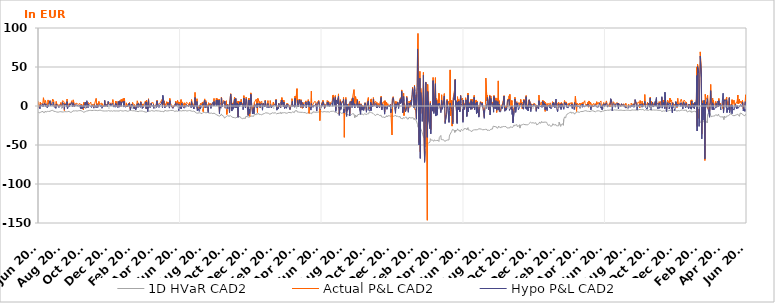
| Category | 1D HVaR CAD2 | Actual P&L CAD2 | Hypo P&L CAD2 |
|---|---|---|---|
| 2017-06-30 | -7.665 | 6.556 | 1.013 |
| 2017-07-03 | -8.736 | -2.044 | -0.77 |
| 2017-07-04 | -7.466 | 0.823 | -1.298 |
| 2017-07-05 | -8.721 | -0.991 | -3.645 |
| 2017-07-06 | -8.22 | 4.793 | 1.523 |
| 2017-07-07 | -7.865 | 1.851 | -0.303 |
| 2017-07-10 | -7.202 | 3.301 | 1.161 |
| 2017-07-11 | -7.861 | 4.235 | 0.22 |
| 2017-07-12 | -7.487 | 1.33 | 2.874 |
| 2017-07-13 | -6.965 | 1.964 | -1.013 |
| 2017-07-14 | -8.392 | 10.584 | 1.428 |
| 2017-07-17 | -8.446 | 1.4 | 3.583 |
| 2017-07-18 | -6.813 | 4.169 | 1.582 |
| 2017-07-19 | -6.78 | 7.102 | -0.508 |
| 2017-07-20 | -7.824 | 5.175 | 2.669 |
| 2017-07-21 | -7.661 | 3.454 | 0.837 |
| 2017-07-24 | -6.897 | 1.02 | -2.542 |
| 2017-07-25 | -7.229 | 4.137 | 0.956 |
| 2017-07-26 | -6.917 | 7.772 | -0.863 |
| 2017-07-27 | -6.972 | 2.997 | -0.088 |
| 2017-07-28 | -7.136 | 4.401 | 0.234 |
| 2017-07-31 | -6.829 | 6.984 | 6.676 |
| 2017-08-01 | -6.113 | 1.55 | 0.236 |
| 2017-08-02 | -6.132 | 0.931 | 2.816 |
| 2017-08-03 | -5.893 | 1.901 | 1.328 |
| 2017-08-04 | -6.124 | 2.612 | 1.423 |
| 2017-08-07 | -5.665 | 8.896 | 0.871 |
| 2017-08-08 | -6.285 | 5.996 | 4.896 |
| 2017-08-09 | -6.179 | 7.435 | 3.178 |
| 2017-08-10 | -6.754 | 4.971 | 2.024 |
| 2017-08-11 | -6.806 | -0.431 | -1.643 |
| 2017-08-14 | -7.089 | 0.208 | -0.708 |
| 2017-08-15 | -7.414 | -1.648 | -3.011 |
| 2017-08-16 | -7.608 | 5.716 | 2.406 |
| 2017-08-17 | -7.654 | 4.615 | 1.592 |
| 2017-08-18 | -7.727 | 1.045 | 1.227 |
| 2017-08-21 | -7.966 | 1.667 | 0.193 |
| 2017-08-22 | -7.742 | 1.239 | -0.055 |
| 2017-08-23 | -7.554 | -0.463 | -2.139 |
| 2017-08-24 | -7.479 | 1.719 | 0.267 |
| 2017-08-25 | -7.022 | 0.143 | 0.042 |
| 2017-08-28 | -7.244 | 4.5 | 1.693 |
| 2017-08-29 | -7.279 | 1.522 | -1.103 |
| 2017-08-30 | -7.347 | 2.32 | -0.086 |
| 2017-08-31 | -7.709 | -0.311 | -2.608 |
| 2017-09-01 | -8.064 | 6.81 | 4.447 |
| 2017-09-04 | -7.595 | 6.241 | 3.167 |
| 2017-09-05 | -7.496 | 4.82 | 1.446 |
| 2017-09-06 | -7.215 | -5.875 | -4.298 |
| 2017-09-07 | -7.239 | 4.048 | 1.929 |
| 2017-09-08 | -7.657 | 1.457 | 0.736 |
| 2017-09-11 | -7.385 | 2.412 | 1.974 |
| 2017-09-12 | -7.322 | 3.681 | -0.904 |
| 2017-09-13 | -7.27 | 8.908 | 5.5 |
| 2017-09-14 | -7.28 | -2.275 | -3.678 |
| 2017-09-15 | -7.859 | 3 | -2.313 |
| 2017-09-18 | -6.779 | 0.09 | 0.648 |
| 2017-09-19 | -6.939 | 3.59 | -1.119 |
| 2017-09-20 | -6.919 | 3.335 | 2.442 |
| 2017-09-21 | -8.062 | 2.416 | 1.151 |
| 2017-09-22 | -8.07 | 2.415 | 0.214 |
| 2017-09-25 | -7.959 | 6.85 | 4.741 |
| 2017-09-26 | -7.657 | 4.799 | 0.805 |
| 2017-09-27 | -7.062 | 1.251 | -1.131 |
| 2017-09-28 | -6.203 | -0.387 | -0.55 |
| 2017-09-29 | -5.855 | 7.843 | 4.039 |
| 2017-10-02 | -6.341 | -0.167 | -1.149 |
| 2017-10-03 | -6.052 | 0.263 | 0.676 |
| 2017-10-04 | -6.248 | 1.795 | 0.16 |
| 2017-10-05 | -6.122 | 2.02 | 1.811 |
| 2017-10-06 | -6.469 | 3.749 | 1.398 |
| 2017-10-09 | -6.471 | 2.981 | 1.281 |
| 2017-10-10 | -5.888 | 2.25 | -0.027 |
| 2017-10-11 | -6.068 | 2.738 | 0.204 |
| 2017-10-12 | -6.073 | 1.963 | 0.523 |
| 2017-10-13 | -5.692 | 2.634 | 0.111 |
| 2017-10-16 | -5.878 | 3.4 | 1.08 |
| 2017-10-17 | -5.782 | 2.147 | -1.862 |
| 2017-10-18 | -5.895 | 4.182 | 1.194 |
| 2017-10-19 | -5.913 | -2.118 | -3.751 |
| 2017-10-20 | -6.761 | 2.38 | 1.331 |
| 2017-10-23 | -7.039 | -1.105 | -3.435 |
| 2017-10-24 | -7.246 | 1.554 | -0.65 |
| 2017-10-25 | -8.241 | -4.882 | -0.85 |
| 2017-10-26 | -7.996 | 4.506 | 1.011 |
| 2017-10-27 | -7.395 | -0.768 | -2.56 |
| 2017-10-30 | -7.276 | 4.737 | 4.769 |
| 2017-10-31 | -6.786 | -2.424 | -2.858 |
| 2017-11-01 | -6.745 | -0.642 | -0.784 |
| 2017-11-02 | -6.505 | 5.08 | 2.363 |
| 2017-11-03 | -6.068 | 0.666 | 6.761 |
| 2017-11-06 | -6.181 | 0.469 | -2.014 |
| 2017-11-07 | -6.971 | 4.508 | 2.454 |
| 2017-11-08 | -6.804 | 4.96 | 3.527 |
| 2017-11-09 | -5.621 | 3.301 | 1.291 |
| 2017-11-10 | -5.436 | 2.225 | 0.687 |
| 2017-11-13 | -5.644 | 4.996 | -0.628 |
| 2017-11-14 | -5.746 | 3.19 | -0.983 |
| 2017-11-15 | -6.133 | 0.758 | -2.01 |
| 2017-11-16 | -5.894 | 1.748 | 0.057 |
| 2017-11-17 | -5.359 | 1.644 | 1.487 |
| 2017-11-20 | -5.626 | 2.256 | -1.486 |
| 2017-11-21 | -6.342 | -1.938 | -2.884 |
| 2017-11-22 | -5.814 | -0.786 | -0.828 |
| 2017-11-23 | -5.562 | 2.935 | 1.632 |
| 2017-11-24 | -5.311 | 3.062 | 0.467 |
| 2017-11-27 | -5.647 | 9.736 | -2.493 |
| 2017-11-28 | -4.719 | 1.336 | 0.535 |
| 2017-11-29 | -5.291 | 3.304 | 1.963 |
| 2017-11-30 | -5.938 | 2.812 | -0.091 |
| 2017-12-01 | -6.282 | -0.957 | -2.197 |
| 2017-12-04 | -5.692 | 5.767 | 1.226 |
| 2017-12-05 | -5.127 | 3.719 | 1.956 |
| 2017-12-06 | -5.177 | 3.158 | 1.196 |
| 2017-12-07 | -5.159 | 2.348 | 1.782 |
| 2017-12-08 | -5 | 1.365 | -0.97 |
| 2017-12-11 | -5.926 | 3.803 | 1.026 |
| 2017-12-12 | -4.933 | -0.133 | -2.885 |
| 2017-12-13 | -5.327 | 2.893 | -1.377 |
| 2017-12-14 | -6.259 | 2.022 | -0.09 |
| 2017-12-15 | -6.352 | 0.302 | 0.049 |
| 2017-12-18 | -6.434 | 1.2 | -0.583 |
| 2017-12-19 | -6.301 | 6.991 | 7.225 |
| 2017-12-20 | -6.864 | 1.833 | -0.191 |
| 2017-12-21 | -6.388 | -0.457 | -1.274 |
| 2017-12-22 | -6.597 | 1.801 | 2.214 |
| 2017-12-26 | -6.359 | 1.319 | -1.292 |
| 2017-12-27 | -6.161 | 1.015 | -1.279 |
| 2017-12-28 | -5.639 | 5.011 | 5.98 |
| 2017-12-29 | -5.86 | 3.197 | 2.404 |
| 2018-01-02 | -6.593 | 4.213 | 1.071 |
| 2018-01-03 | -6.294 | 5.059 | 2.886 |
| 2018-01-04 | -5.927 | 1.002 | 0.179 |
| 2018-01-05 | -6.091 | 2.884 | 0.787 |
| 2018-01-08 | -6.718 | 4.931 | 3.457 |
| 2018-01-09 | -6.24 | 8.214 | 3.004 |
| 2018-01-10 | -6.098 | 4.228 | 2.962 |
| 2018-01-11 | -6.09 | 2.251 | -1.362 |
| 2018-01-12 | -6.303 | 2.98 | 0.914 |
| 2018-01-15 | -6.422 | 0.087 | -1.624 |
| 2018-01-16 | -6.323 | 6.084 | 3.629 |
| 2018-01-17 | -6.538 | 0.494 | -0.535 |
| 2018-01-18 | -6.32 | 5.716 | 2.665 |
| 2018-01-19 | -6.38 | 2.439 | -0.205 |
| 2018-01-22 | -6.398 | -0.852 | -2.18 |
| 2018-01-23 | -6.743 | 5.699 | 5.684 |
| 2018-01-24 | -6.317 | 6.515 | 3.678 |
| 2018-01-25 | -6.479 | -0.916 | -1.582 |
| 2018-01-26 | -5.455 | 6.332 | 5.846 |
| 2018-01-29 | -5.677 | 8.105 | 5.537 |
| 2018-01-30 | -6.53 | -0.321 | -0.484 |
| 2018-01-31 | -6.691 | 2.122 | 0.169 |
| 2018-02-01 | -6.287 | 8.636 | 4.873 |
| 2018-02-02 | -5.573 | 5.203 | 4.195 |
| 2018-02-05 | -6.504 | 9.663 | 5.501 |
| 2018-02-06 | -6.268 | 1.329 | -1.35 |
| 2018-02-07 | -6.415 | 5.422 | 5.962 |
| 2018-02-08 | -6.052 | 9.857 | -0.484 |
| 2018-02-09 | -6.04 | -0.373 | -1.373 |
| 2018-02-12 | -5.917 | 0.584 | -1.479 |
| 2018-02-13 | -6.483 | 4.019 | -0.646 |
| 2018-02-14 | -6.437 | -0.803 | -1.588 |
| 2018-02-15 | -6.756 | 0.089 | 0.252 |
| 2018-02-16 | -6.65 | 1.439 | -1.14 |
| 2018-02-19 | -6.479 | 3.38 | 2.998 |
| 2018-02-20 | -6.079 | 2.05 | -0.335 |
| 2018-02-21 | -6.172 | 4.531 | 3.234 |
| 2018-02-22 | -5.66 | -2.239 | 0.614 |
| 2018-02-23 | -6.359 | -4.019 | -5.205 |
| 2018-02-26 | -5.815 | 2.404 | 0.808 |
| 2018-02-27 | -6.21 | 0.741 | 2.629 |
| 2018-02-28 | -6.742 | -1.139 | -1.282 |
| 2018-03-01 | -6.119 | 4.418 | 1.337 |
| 2018-03-02 | -6.363 | 2.639 | 2.295 |
| 2018-03-05 | -6.043 | -1.891 | -3.845 |
| 2018-03-06 | -5.866 | 1.803 | 0.067 |
| 2018-03-07 | -6.4 | 0.363 | -1.423 |
| 2018-03-08 | -6.586 | 0.149 | -2.284 |
| 2018-03-09 | -6.577 | -3.838 | -5.225 |
| 2018-03-12 | -6.674 | 3.198 | 1.242 |
| 2018-03-13 | -6.298 | 6.641 | 2.757 |
| 2018-03-14 | -7.076 | 4.588 | 1.021 |
| 2018-03-15 | -7.362 | -1.007 | -1.97 |
| 2018-03-16 | -7.093 | 3.964 | 3.247 |
| 2018-03-19 | -6.499 | 1.345 | -0.3 |
| 2018-03-20 | -7.053 | -1.056 | -1.407 |
| 2018-03-21 | -6.725 | -0.002 | -1.852 |
| 2018-03-22 | -6.436 | 5.664 | 5.035 |
| 2018-03-23 | -6.732 | 5.135 | 3.273 |
| 2018-03-26 | -6.471 | -1.286 | -3.153 |
| 2018-03-27 | -6.438 | 2.615 | -0.925 |
| 2018-03-28 | -6.872 | 0.713 | -2.5 |
| 2018-03-29 | -7.042 | 1.297 | -0.701 |
| 2018-03-30 | -7.055 | 1.988 | -0.311 |
| 2018-04-02 | -7.569 | 5.054 | 2.227 |
| 2018-04-03 | -6.856 | 6.452 | 1.336 |
| 2018-04-04 | -8.219 | 6.023 | 5.219 |
| 2018-04-05 | -8.048 | -3.247 | -3.25 |
| 2018-04-06 | -7.232 | 7.484 | 5.141 |
| 2018-04-09 | -6.97 | -3.64 | -6.906 |
| 2018-04-10 | -7.793 | 1.901 | -1.211 |
| 2018-04-11 | -7.561 | 9.306 | 8.168 |
| 2018-04-12 | -6.63 | 0.476 | -1.902 |
| 2018-04-13 | -6.198 | 1.599 | 0.527 |
| 2018-04-16 | -6.549 | 0.901 | -2.034 |
| 2018-04-17 | -6.818 | 1.982 | 0.374 |
| 2018-04-18 | -6.401 | 3.956 | 3.692 |
| 2018-04-19 | -5.888 | 3.21 | 0.803 |
| 2018-04-20 | -6.791 | 3.047 | 0.497 |
| 2018-04-23 | -6.343 | 4.336 | -0.385 |
| 2018-04-24 | -5.814 | 3.721 | 1.862 |
| 2018-04-25 | -6.082 | -1.936 | -3.139 |
| 2018-04-26 | -6.665 | 0.142 | -3.444 |
| 2018-04-27 | -6.075 | -0.745 | -0.963 |
| 2018-04-30 | -5.927 | 0.252 | 0.935 |
| 2018-05-01 | -5.637 | 2.891 | -1.941 |
| 2018-05-02 | -6.065 | -0.801 | -2.804 |
| 2018-05-03 | -6.283 | 7.23 | 6.497 |
| 2018-05-04 | -6.302 | 3.206 | -0.565 |
| 2018-05-07 | -6.28 | 2.605 | 1.769 |
| 2018-05-08 | -6.392 | 2.463 | -1.83 |
| 2018-05-09 | -6.441 | 2.21 | -0.58 |
| 2018-05-10 | -6.532 | 3.191 | 1.517 |
| 2018-05-11 | -6.669 | 3.978 | 1.018 |
| 2018-05-14 | -6.991 | 6.816 | 2.597 |
| 2018-05-15 | -7.473 | 8.173 | 5.452 |
| 2018-05-16 | -7.265 | 5.834 | 4.024 |
| 2018-05-17 | -6.9 | 0.166 | -2.106 |
| 2018-05-18 | -7.552 | 5.664 | 13.638 |
| 2018-05-21 | -7.523 | 1.119 | 3.233 |
| 2018-05-22 | -6.931 | 6.521 | 1.516 |
| 2018-05-23 | -5.555 | -0.455 | -2.523 |
| 2018-05-24 | -5.652 | 2.126 | -0.894 |
| 2018-05-25 | -5.963 | -0.236 | -0.842 |
| 2018-05-28 | -6.425 | 5.547 | -0.209 |
| 2018-05-29 | -7.109 | 4.509 | 0.785 |
| 2018-05-30 | -6.306 | 2.2 | 1.084 |
| 2018-05-31 | -6.303 | 5.106 | 3.642 |
| 2018-06-01 | -6.684 | 4.896 | 2.266 |
| 2018-06-04 | -5.961 | -1.097 | -2.7 |
| 2018-06-05 | -5.661 | 9.617 | 6.862 |
| 2018-06-06 | -5.717 | 4.31 | 1.829 |
| 2018-06-07 | -5.732 | 3.802 | 2.228 |
| 2018-06-08 | -5.233 | 2.433 | 1.336 |
| 2018-06-11 | -5.66 | -0.082 | -1.745 |
| 2018-06-12 | -5.429 | -2.465 | -2.976 |
| 2018-06-13 | -5.466 | -1.682 | -3.171 |
| 2018-06-14 | -5.829 | -1.159 | -3.322 |
| 2018-06-15 | -5.743 | -1.055 | -0.569 |
| 2018-06-18 | -7.061 | 2.239 | -0.002 |
| 2018-06-19 | -6.649 | 0.651 | -0.591 |
| 2018-06-20 | -6.299 | 6.087 | 4.163 |
| 2018-06-21 | -6.249 | 1.815 | 0.041 |
| 2018-06-22 | -6.181 | 1.159 | 0.161 |
| 2018-06-25 | -6.787 | 7.105 | 3.151 |
| 2018-06-26 | -6.511 | 3.333 | 0.947 |
| 2018-06-27 | -6.67 | 5.214 | 1.276 |
| 2018-06-28 | -6.092 | 1.524 | -5.756 |
| 2018-06-29 | -6.13 | 5.018 | 2.015 |
| 2018-07-02 | -6.105 | 0.344 | -3.248 |
| 2018-07-03 | -6.357 | 1.463 | -2.886 |
| 2018-07-04 | -6.588 | 8.232 | 0.92 |
| 2018-07-05 | -6.408 | -1.893 | -3.401 |
| 2018-07-06 | -6.1 | 5.354 | 3.421 |
| 2018-07-09 | -5.881 | 4.075 | -0.804 |
| 2018-07-10 | -5.771 | 2.534 | 0.412 |
| 2018-07-11 | -6.226 | 2.849 | 0.386 |
| 2018-07-12 | -6.109 | -1.086 | -2.846 |
| 2018-07-13 | -6.57 | 4.052 | 0.694 |
| 2018-07-16 | -5.783 | 0.755 | -1.655 |
| 2018-07-17 | -6.712 | 3.376 | 0.153 |
| 2018-07-18 | -6.858 | 4.755 | 1.989 |
| 2018-07-19 | -6.478 | 3.851 | 0.726 |
| 2018-07-20 | -5.991 | 3.904 | 1.931 |
| 2018-07-23 | -6.012 | 2.566 | -0.891 |
| 2018-07-24 | -6.018 | 0.43 | -1.311 |
| 2018-07-25 | -5.929 | -0.305 | -1.621 |
| 2018-07-26 | -5.744 | 4.61 | 2.17 |
| 2018-07-27 | -6.374 | 3.145 | 2.017 |
| 2018-07-30 | -6.364 | -0.165 | -2.108 |
| 2018-07-31 | -6.394 | 8.186 | 5.541 |
| 2018-08-01 | -6.777 | 8.94 | 4.756 |
| 2018-08-02 | -6.831 | 0.041 | -1.011 |
| 2018-08-03 | -7.101 | 3.053 | 1.386 |
| 2018-08-06 | -6.51 | -1.424 | -3.861 |
| 2018-08-07 | -6.526 | 1.113 | -1.551 |
| 2018-08-08 | -7.227 | 1.223 | 0.71 |
| 2018-08-09 | -7.652 | 17.463 | 10.902 |
| 2018-08-10 | -8.714 | 3.3 | 0.598 |
| 2018-08-13 | -9.066 | 0.535 | -1.642 |
| 2018-08-14 | -8.79 | 9.318 | 5.803 |
| 2018-08-15 | -9.415 | -4.045 | -5.883 |
| 2018-08-16 | -9.191 | 0.111 | -2.187 |
| 2018-08-17 | -9.323 | -1.094 | -2.598 |
| 2018-08-20 | -8.637 | -3.775 | -6.973 |
| 2018-08-21 | -8.67 | -3.9 | -5.49 |
| 2018-08-22 | -8.476 | 1.58 | 1.133 |
| 2018-08-23 | -9.022 | -1.201 | -3.441 |
| 2018-08-24 | -9.507 | 3.767 | -0.306 |
| 2018-08-27 | -9.848 | 1.004 | -1.855 |
| 2018-08-28 | -8.641 | 5.166 | 3.028 |
| 2018-08-29 | -8.688 | 3.952 | 3.13 |
| 2018-08-30 | -8.214 | -7.116 | 0.898 |
| 2018-08-31 | -8.327 | 3.768 | 2.082 |
| 2018-09-03 | -8.245 | 9.125 | 7.499 |
| 2018-09-04 | -9.431 | -0.417 | -2.143 |
| 2018-09-05 | -9.014 | 2.181 | -1.717 |
| 2018-09-06 | -8.809 | 6.875 | 4.728 |
| 2018-09-07 | -8.94 | 0.253 | -1.824 |
| 2018-09-10 | -8.297 | 1.717 | 0.071 |
| 2018-09-11 | -9.289 | -1.919 | -3.19 |
| 2018-09-12 | -9.132 | -6.634 | -8.279 |
| 2018-09-13 | -8.796 | 4.156 | 1.034 |
| 2018-09-14 | -8.418 | 0.77 | 0.004 |
| 2018-09-17 | -9.327 | 3.823 | 1.67 |
| 2018-09-18 | -8.792 | 4.463 | 0.827 |
| 2018-09-19 | -8.969 | -1.631 | -3.106 |
| 2018-09-20 | -8.995 | 0.41 | 0.941 |
| 2018-09-21 | -8.354 | 2.886 | 2.005 |
| 2018-09-24 | -9.83 | 3.989 | 4.59 |
| 2018-09-25 | -10.018 | 0.911 | -0.072 |
| 2018-09-26 | -9.277 | 5.372 | -0.127 |
| 2018-09-27 | -9.047 | 9.713 | 5.647 |
| 2018-09-28 | -9.656 | 1.657 | 0.097 |
| 2018-10-01 | -10.491 | 2.689 | 1.813 |
| 2018-10-02 | -9.803 | 2.557 | 1.574 |
| 2018-10-03 | -10.574 | 9.996 | 7.554 |
| 2018-10-04 | -11.31 | 3.029 | 0.27 |
| 2018-10-05 | -12.262 | 9.466 | 7.757 |
| 2018-10-08 | -12.366 | 1.344 | 0.954 |
| 2018-10-09 | -11.596 | 5.326 | 1.742 |
| 2018-10-10 | -11.92 | 8.942 | 7.492 |
| 2018-10-11 | -12.994 | -7.854 | -9.692 |
| 2018-10-12 | -12.214 | 0.76 | -0.397 |
| 2018-10-15 | -11.796 | 4.646 | -2.862 |
| 2018-10-16 | -10.141 | 11.299 | 10.458 |
| 2018-10-17 | -11.732 | 8.801 | 5.503 |
| 2018-10-18 | -12.898 | -0.737 | -0.998 |
| 2018-10-19 | -12.349 | 3.732 | 1.804 |
| 2018-10-22 | -13.195 | 7.25 | 4.35 |
| 2018-10-23 | -13.759 | 5.836 | 5.646 |
| 2018-10-24 | -15.449 | 5.157 | 2.909 |
| 2018-10-25 | -16.031 | 7.096 | 6.069 |
| 2018-10-26 | -14.398 | -2.894 | -2.054 |
| 2018-10-29 | -13.391 | 6.664 | 1.083 |
| 2018-10-30 | -13.029 | -10.807 | -3.852 |
| 2018-10-31 | -12.582 | -4.691 | -4.93 |
| 2018-11-01 | -12.341 | 2.006 | 1.705 |
| 2018-11-02 | -13.145 | -0.048 | -1.415 |
| 2018-11-05 | -13.187 | 2.056 | -3.935 |
| 2018-11-06 | -12.691 | -5.414 | -8.578 |
| 2018-11-07 | -12.024 | 7.177 | 5.035 |
| 2018-11-08 | -12.166 | 11.552 | 12.217 |
| 2018-11-09 | -13.445 | 15.844 | 15.309 |
| 2018-11-12 | -14.147 | 1.756 | -6.454 |
| 2018-11-13 | -14.241 | 3.839 | 2.57 |
| 2018-11-14 | -14.931 | 3.26 | 1.197 |
| 2018-11-15 | -14.607 | -1.913 | -4.257 |
| 2018-11-16 | -15.526 | 1.7 | -0.224 |
| 2018-11-19 | -14.953 | 11.423 | 8.916 |
| 2018-11-20 | -15.981 | 1.048 | -1.859 |
| 2018-11-21 | -15.628 | -1.916 | -2.965 |
| 2018-11-22 | -15.256 | 9.374 | 9.591 |
| 2018-11-23 | -15.126 | -0.311 | -2.298 |
| 2018-11-26 | -14.148 | 5.756 | 3.873 |
| 2018-11-27 | -13.959 | -1.573 | -5.353 |
| 2018-11-28 | -13.539 | -13.615 | -14.516 |
| 2018-11-29 | -14.101 | 6.351 | 2.031 |
| 2018-11-30 | -14.34 | 2.364 | -0.783 |
| 2018-12-03 | -13.393 | 6.039 | 4.937 |
| 2018-12-04 | -14.826 | 2.231 | 1.086 |
| 2018-12-05 | -14.924 | 4.927 | 0.587 |
| 2018-12-06 | -15.743 | 8.733 | 5.062 |
| 2018-12-07 | -15.688 | 2.379 | 1.889 |
| 2018-12-10 | -16.338 | 3.213 | 2.125 |
| 2018-12-11 | -15.77 | -0.957 | -4.746 |
| 2018-12-12 | -15.249 | -1.818 | -3.994 |
| 2018-12-13 | -15.528 | 13.254 | 9.977 |
| 2018-12-14 | -15.742 | 3.346 | 1.565 |
| 2018-12-17 | -15.925 | 0.432 | -2.452 |
| 2018-12-18 | -13.421 | 0.644 | -1.755 |
| 2018-12-19 | -13.633 | 11.426 | 9.198 |
| 2018-12-20 | -13.838 | 7.77 | 7.493 |
| 2018-12-21 | -13.453 | 6.716 | 8.164 |
| 2018-12-24 | -14.066 | -11.08 | -12.327 |
| 2018-12-26 | -13.773 | 10.13 | 7.735 |
| 2018-12-27 | -14.255 | -1.484 | 0.085 |
| 2018-12-28 | -13.65 | -13.163 | -9.82 |
| 2018-12-31 | -13.055 | 16.814 | 14.988 |
| 2019-01-02 | -12.382 | 2.161 | 1.366 |
| 2019-01-03 | -12.876 | -3.85 | -1.556 |
| 2019-01-04 | -13.781 | -6.988 | -10.217 |
| 2019-01-07 | -13.306 | 1.164 | -2.532 |
| 2019-01-08 | -13.582 | -7.074 | -10 |
| 2019-01-09 | -10.676 | 4.604 | -0.156 |
| 2019-01-10 | -9.804 | 3.783 | -0.679 |
| 2019-01-11 | -10.363 | 3.974 | 1.948 |
| 2019-01-14 | -11.26 | 8.801 | -1.987 |
| 2019-01-15 | -9.726 | -0.103 | -0.227 |
| 2019-01-16 | -9.953 | 6.126 | 3.442 |
| 2019-01-17 | -10.468 | -8.299 | -2.391 |
| 2019-01-18 | -10.4 | 9.755 | 0.485 |
| 2019-01-21 | -9.652 | 5.589 | 3.447 |
| 2019-01-22 | -11.055 | 2.495 | 0.702 |
| 2019-01-23 | -11.105 | 5.627 | 2.757 |
| 2019-01-24 | -10.377 | -2.147 | -1.623 |
| 2019-01-25 | -10.891 | 3.898 | 2.046 |
| 2019-01-28 | -11.266 | 6.062 | 3.432 |
| 2019-01-29 | -10.874 | 1.139 | -2.057 |
| 2019-01-30 | -11.253 | 1.645 | -5.367 |
| 2019-01-31 | -10.316 | 0.772 | 1.466 |
| 2019-02-01 | -9.978 | 3.906 | 3.584 |
| 2019-02-04 | -9.641 | -0.159 | -1.264 |
| 2019-02-05 | -8.717 | 1.895 | 1.398 |
| 2019-02-06 | -9.035 | 7.502 | 6.654 |
| 2019-02-07 | -8.756 | 6.425 | 6.176 |
| 2019-02-08 | -9.39 | 0.56 | -0.614 |
| 2019-02-11 | -8.948 | -0.32 | -2.269 |
| 2019-02-12 | -9.303 | 2.397 | -0.867 |
| 2019-02-13 | -9.184 | 6.951 | 3.221 |
| 2019-02-14 | -9.255 | -1.299 | -1.754 |
| 2019-02-15 | -10.039 | -0.597 | -2.546 |
| 2019-02-18 | -10.531 | -0.213 | -1.568 |
| 2019-02-19 | -10.686 | 6.953 | -0.704 |
| 2019-02-20 | -9.341 | 3.58 | 1.765 |
| 2019-02-21 | -9.822 | 2.052 | 1.32 |
| 2019-02-22 | -9.059 | -0.479 | -2.539 |
| 2019-02-25 | -8.658 | 1.194 | 0.352 |
| 2019-02-26 | -9.695 | 0.768 | 0.032 |
| 2019-02-27 | -9.543 | 5.099 | 1.53 |
| 2019-02-28 | -9.125 | 1.446 | 0.89 |
| 2019-03-01 | -9.17 | 1.524 | 1.609 |
| 2019-03-04 | -8.629 | 3.257 | 2.078 |
| 2019-03-05 | -9.209 | 2.282 | 0.139 |
| 2019-03-06 | -9.739 | 8.638 | 7.828 |
| 2019-03-07 | -9.999 | 8.272 | 7.009 |
| 2019-03-08 | -10.186 | -3.025 | -5.296 |
| 2019-03-11 | -9.379 | -0.902 | -1.895 |
| 2019-03-12 | -9.941 | -0.913 | -3.436 |
| 2019-03-13 | -8.407 | 3.643 | 3.023 |
| 2019-03-14 | -9.358 | 0.258 | 0.029 |
| 2019-03-15 | -8.962 | 0.125 | -1.025 |
| 2019-03-18 | -8.029 | -1.752 | -2.428 |
| 2019-03-19 | -10.144 | 7.738 | 5.327 |
| 2019-03-20 | -8.846 | 4.312 | 1.242 |
| 2019-03-21 | -7.915 | 10.777 | 7.406 |
| 2019-03-22 | -8.5 | 4.173 | 4.12 |
| 2019-03-25 | -8.689 | 0.508 | -1.321 |
| 2019-03-26 | -8.79 | 7.423 | 5.08 |
| 2019-03-27 | -8.089 | 4.072 | 2.583 |
| 2019-03-28 | -8.457 | 4.175 | -3.334 |
| 2019-03-29 | -7.866 | -1.805 | -3.393 |
| 2019-04-01 | -9.244 | 1.385 | 0.981 |
| 2019-04-02 | -8.366 | 0.855 | -2.904 |
| 2019-04-03 | -9.209 | 3.664 | 2.02 |
| 2019-04-04 | -9.102 | 0.548 | -1.151 |
| 2019-04-05 | -8.256 | 3.092 | 2.11 |
| 2019-04-08 | -8.093 | 1.558 | -0.557 |
| 2019-04-09 | -8.805 | 2.671 | 0.45 |
| 2019-04-10 | -9.118 | -0.095 | 0.684 |
| 2019-04-11 | -8.485 | -4.278 | -4.855 |
| 2019-04-12 | -9.107 | -1.513 | -2.408 |
| 2019-04-15 | -8.582 | 2.869 | 0.668 |
| 2019-04-16 | -8.009 | 9.402 | 0.996 |
| 2019-04-17 | -8.234 | 6.427 | 5.998 |
| 2019-04-18 | -7.417 | -0.035 | -0.563 |
| 2019-04-19 | -7.524 | -0.243 | 0.233 |
| 2019-04-22 | -8.478 | 1.283 | 0.942 |
| 2019-04-23 | -7.746 | -0.828 | -1.596 |
| 2019-04-24 | -6.143 | 12.615 | 9.705 |
| 2019-04-25 | -6.268 | 1.956 | -0.047 |
| 2019-04-26 | -5.978 | 1.583 | 0.88 |
| 2019-04-29 | -6.085 | 22.223 | -1.51 |
| 2019-04-30 | -7.724 | 3.567 | 3.293 |
| 2019-05-01 | -7.783 | 8.946 | 7.359 |
| 2019-05-02 | -7.584 | -0.537 | -1.202 |
| 2019-05-03 | -7.789 | 0.618 | 0.467 |
| 2019-05-06 | -8.039 | 8.659 | 7.788 |
| 2019-05-07 | -8.217 | 4.593 | 4.442 |
| 2019-05-08 | -8.389 | 5.789 | 3.627 |
| 2019-05-09 | -8.089 | -2.012 | -1.578 |
| 2019-05-10 | -7.818 | 7.936 | 6.664 |
| 2019-05-13 | -8.123 | -2.907 | 1.895 |
| 2019-05-14 | -7.338 | 4.528 | 1.507 |
| 2019-05-15 | -8.281 | -0.601 | -2.103 |
| 2019-05-16 | -8.457 | 3.33 | 1.967 |
| 2019-05-17 | -8.541 | 2.67 | 0.405 |
| 2019-05-20 | -8.393 | 4.061 | 1.52 |
| 2019-05-21 | -8.619 | 4.635 | 0.526 |
| 2019-05-22 | -8.397 | 6.587 | 5.119 |
| 2019-05-23 | -9.381 | -1.599 | -2.248 |
| 2019-05-24 | -9.263 | 2.384 | 2.494 |
| 2019-05-27 | -8.854 | 3.92 | 2.089 |
| 2019-05-28 | -8.106 | 8.184 | 6.055 |
| 2019-05-29 | -8.265 | 0.521 | -1.121 |
| 2019-05-30 | -7.834 | -9.489 | 5.497 |
| 2019-05-31 | -9.293 | 0.117 | -0.169 |
| 2019-06-03 | -9.287 | -2.439 | -3.429 |
| 2019-06-04 | -8.639 | -3.332 | -5.238 |
| 2019-06-05 | -8.43 | 19.104 | 3.149 |
| 2019-06-06 | -9.996 | -1.416 | -1.622 |
| 2019-06-07 | -8.003 | 0.865 | 0.149 |
| 2019-06-10 | -8.345 | 2.741 | -1.645 |
| 2019-06-11 | -6.976 | 3.34 | 1.17 |
| 2019-06-12 | -7.053 | 3.968 | 2.177 |
| 2019-06-13 | -7.464 | 5.737 | 1.25 |
| 2019-06-14 | -8.162 | 5.404 | 0.311 |
| 2019-06-17 | -7.838 | 5.016 | 3.2 |
| 2019-06-18 | -7.707 | -1.182 | -3.493 |
| 2019-06-19 | -7.63 | -0.902 | -6.502 |
| 2019-06-20 | -7.934 | 2.08 | 0.368 |
| 2019-06-21 | -8.075 | 5.023 | 1.842 |
| 2019-06-24 | -7.686 | 7.359 | 5.923 |
| 2019-06-25 | -7.225 | 5.858 | 1.608 |
| 2019-06-26 | -7.103 | 1.74 | -1.499 |
| 2019-06-27 | -7.167 | -18.792 | -1.442 |
| 2019-06-28 | -7.39 | -3.999 | -4.504 |
| 2019-07-01 | -7.2 | 1.568 | -0.482 |
| 2019-07-02 | -7.579 | 4.286 | 2.899 |
| 2019-07-03 | -7.758 | 2.389 | -0.116 |
| 2019-07-04 | -7.72 | 2.907 | 1.884 |
| 2019-07-05 | -8.108 | 7.273 | 5.456 |
| 2019-07-08 | -7.135 | 1.498 | 0.677 |
| 2019-07-09 | -7.459 | -3.087 | -2.884 |
| 2019-07-10 | -7.038 | -2.006 | -3.798 |
| 2019-07-11 | -7.294 | 1.837 | 0.773 |
| 2019-07-12 | -8.064 | 2.707 | 1.63 |
| 2019-07-15 | -7.574 | 3.217 | 1.333 |
| 2019-07-16 | -7.201 | 7.014 | 4.752 |
| 2019-07-17 | -8.129 | 6.707 | 2.654 |
| 2019-07-18 | -7.335 | 2.095 | -0.253 |
| 2019-07-19 | -7.448 | 6.124 | 4.341 |
| 2019-07-22 | -7.91 | 4.748 | -0.515 |
| 2019-07-23 | -7.166 | 0.48 | -0.792 |
| 2019-07-24 | -6.688 | 1.423 | 0.319 |
| 2019-07-25 | -6.878 | 4.484 | 0.984 |
| 2019-07-26 | -6.674 | 4.187 | 2.919 |
| 2019-07-29 | -6.794 | 5.763 | 4.339 |
| 2019-07-30 | -7.192 | 13.524 | -0.221 |
| 2019-07-31 | -6.907 | 7.572 | 7.485 |
| 2019-08-01 | -6.633 | 14.125 | 10.673 |
| 2019-08-02 | -7.225 | 11.747 | 10.988 |
| 2019-08-05 | -7.88 | 2.706 | 0.604 |
| 2019-08-06 | -7.931 | 13.255 | 11.056 |
| 2019-08-07 | -8.1 | -4.697 | -6.779 |
| 2019-08-08 | -7.904 | 7.799 | 2.451 |
| 2019-08-09 | -7.933 | 7.853 | 7.341 |
| 2019-08-12 | -9.709 | 2.841 | 2.886 |
| 2019-08-13 | -9.554 | 10.562 | 9.722 |
| 2019-08-14 | -8.639 | 15.541 | 12.401 |
| 2019-08-15 | -8.822 | -0.484 | -2.963 |
| 2019-08-16 | -9.24 | -10.4 | -12.047 |
| 2019-08-19 | -8.459 | 8.024 | 5.677 |
| 2019-08-20 | -9.099 | -2.992 | -4.461 |
| 2019-08-21 | -8.927 | -3.708 | -4.303 |
| 2019-08-22 | -9.466 | 3.594 | 2.644 |
| 2019-08-23 | -8.937 | 6.07 | 4.62 |
| 2019-08-26 | -8.678 | 4.699 | 5.866 |
| 2019-08-27 | -9.36 | 10.987 | 8.716 |
| 2019-08-28 | -9.36 | -7.841 | -8.843 |
| 2019-08-29 | -9.885 | -40.202 | 1.508 |
| 2019-08-30 | -10.079 | -0.394 | 0.179 |
| 2019-09-02 | -10.108 | 10.967 | 8.162 |
| 2019-09-03 | -10.265 | -6.199 | -7.966 |
| 2019-09-04 | -10.076 | -9.137 | -13.332 |
| 2019-09-05 | -10.636 | 1.195 | 2.365 |
| 2019-09-06 | -11.646 | -6.584 | -6.2 |
| 2019-09-09 | -11.499 | 2.683 | -0.168 |
| 2019-09-10 | -11.288 | -0.002 | -2.678 |
| 2019-09-11 | -12.245 | -3.104 | -5.535 |
| 2019-09-12 | -12.376 | -9.812 | -12.603 |
| 2019-09-13 | -12.04 | 5.02 | 5.621 |
| 2019-09-16 | -11.055 | 6.915 | 3.878 |
| 2019-09-17 | -11.172 | 9.335 | 6.365 |
| 2019-09-18 | -11.566 | 0.952 | -1.871 |
| 2019-09-19 | -9.945 | 5.096 | 2.749 |
| 2019-09-20 | -10.562 | 12.936 | 10.461 |
| 2019-09-23 | -10.165 | 21.023 | 0.48 |
| 2019-09-24 | -10.628 | 6.577 | 2.731 |
| 2019-09-25 | -15.009 | 2.419 | -2.523 |
| 2019-09-26 | -14.141 | 4.079 | 1.776 |
| 2019-09-27 | -11.522 | 12.176 | 0.875 |
| 2019-09-30 | -13.937 | 1.629 | 0.756 |
| 2019-10-01 | -14.064 | 8.917 | 4.567 |
| 2019-10-02 | -12.845 | 8.475 | 7.686 |
| 2019-10-03 | -10.96 | 0.703 | -1.871 |
| 2019-10-04 | -11.331 | -1.528 | -2.861 |
| 2019-10-07 | -10.868 | 6.291 | 2.638 |
| 2019-10-08 | -10.031 | -4.724 | -5.835 |
| 2019-10-09 | -9.299 | -5.365 | -6.107 |
| 2019-10-10 | -10.597 | -6.474 | -10.676 |
| 2019-10-11 | -10.143 | 2.887 | 1.85 |
| 2019-10-14 | -10.238 | -5.13 | -5.253 |
| 2019-10-15 | -10.588 | 0.67 | -4.65 |
| 2019-10-16 | -10.492 | 0.583 | -0.688 |
| 2019-10-17 | -11.332 | -1.09 | -1.626 |
| 2019-10-18 | -10.724 | -4.356 | -5.605 |
| 2019-10-21 | -9.801 | 4.103 | 2.599 |
| 2019-10-22 | -10 | 5.161 | 4.038 |
| 2019-10-23 | -10.337 | 1.286 | 0.477 |
| 2019-10-24 | -10.986 | -3.555 | -4.033 |
| 2019-10-25 | -9.852 | -6.49 | -8.012 |
| 2019-10-28 | -10.029 | 7.193 | 3.795 |
| 2019-10-29 | -9.812 | 7.975 | 4.858 |
| 2019-10-30 | -9.297 | 10.869 | 6.492 |
| 2019-10-31 | -9.95 | -3.139 | -4.741 |
| 2019-11-01 | -7.696 | -1.62 | -6.315 |
| 2019-11-04 | -8.011 | -4.409 | -5.52 |
| 2019-11-05 | -8.694 | 8.306 | 4.939 |
| 2019-11-06 | -8.46 | -3.48 | -6.009 |
| 2019-11-07 | -8.529 | 9.089 | 2.811 |
| 2019-11-08 | -9.446 | 0.723 | -0.191 |
| 2019-11-11 | -9.364 | 3.056 | -0.866 |
| 2019-11-12 | -10.11 | 10.837 | 9.041 |
| 2019-11-13 | -10.438 | 6.839 | 3.085 |
| 2019-11-14 | -10.981 | 1.848 | 0.279 |
| 2019-11-15 | -11.038 | 4.708 | 0.042 |
| 2019-11-18 | -12.231 | 6.229 | 3.327 |
| 2019-11-19 | -11.484 | 6.326 | 4.295 |
| 2019-11-20 | -11.239 | -0.183 | -2.028 |
| 2019-11-21 | -10.512 | 4.518 | 1.455 |
| 2019-11-22 | -10.965 | -2.516 | -2.348 |
| 2019-11-25 | -10.928 | 3.109 | 0.536 |
| 2019-11-26 | -11.612 | 2.06 | 0.312 |
| 2019-11-27 | -11.197 | 2.347 | 0.443 |
| 2019-11-28 | -12.19 | -0.87 | -2.487 |
| 2019-11-29 | -10.981 | -1.436 | 0.204 |
| 2019-12-02 | -11.876 | 12.447 | 10.961 |
| 2019-12-03 | -13.895 | -4.297 | -1.259 |
| 2019-12-04 | -13.744 | -3.502 | -4.989 |
| 2019-12-05 | -13.448 | 4.078 | -0.136 |
| 2019-12-06 | -14.335 | 3.213 | 2.251 |
| 2019-12-09 | -14.119 | 4.05 | 0.43 |
| 2019-12-10 | -14.102 | 6.48 | 1.265 |
| 2019-12-11 | -13.608 | -7.758 | -10.487 |
| 2019-12-12 | -15.03 | 6.83 | -0.516 |
| 2019-12-13 | -14.121 | -0.205 | -2.262 |
| 2019-12-16 | -12.4 | 4.639 | -0.89 |
| 2019-12-17 | -14.114 | 0.092 | -4.242 |
| 2019-12-18 | -13.006 | -0.88 | -2.979 |
| 2019-12-19 | -12.695 | 2.944 | -0.16 |
| 2019-12-20 | -13.547 | 1.168 | -1.096 |
| 2019-12-23 | -12.44 | 1.179 | 0.594 |
| 2019-12-24 | -13.134 | -0.795 | -0.784 |
| 2019-12-26 | -13.259 | 2.094 | 1.682 |
| 2019-12-27 | -13.648 | -7.104 | -8.615 |
| 2019-12-30 | -12.615 | -37.171 | 0.817 |
| 2019-12-31 | -13.256 | 9.218 | 6.713 |
| 2020-01-02 | -13.295 | 12.088 | 10.713 |
| 2020-01-03 | -13.69 | 9.533 | 7.442 |
| 2020-01-06 | -12.552 | 0.689 | -2.133 |
| 2020-01-07 | -12.665 | -0.995 | -2.438 |
| 2020-01-08 | -12.585 | -6.715 | -9.387 |
| 2020-01-09 | -11.891 | 5.907 | 2.75 |
| 2020-01-10 | -13.35 | 0.51 | -1.799 |
| 2020-01-13 | -13.104 | 5.27 | 3.318 |
| 2020-01-14 | -13.263 | 6.24 | 4.792 |
| 2020-01-15 | -14.127 | 4.273 | 1.144 |
| 2020-01-16 | -13.764 | -0.583 | -3.21 |
| 2020-01-17 | -13.774 | 2.805 | 1.283 |
| 2020-01-20 | -13.569 | 9.51 | 7.929 |
| 2020-01-21 | -15.546 | 7.487 | 2.802 |
| 2020-01-22 | -15.437 | 10.657 | 9.269 |
| 2020-01-23 | -16.567 | 4.606 | 4.658 |
| 2020-01-24 | -16.129 | 20.584 | 18.666 |
| 2020-01-27 | -16.385 | -5.868 | -8.584 |
| 2020-01-28 | -14.877 | 5.598 | 2.022 |
| 2020-01-29 | -15.713 | 16.383 | 12.374 |
| 2020-01-30 | -15.278 | -12.271 | 5.756 |
| 2020-01-31 | -15.514 | 3.465 | -2.645 |
| 2020-02-03 | -14.396 | -6.037 | -7.289 |
| 2020-02-04 | -14.151 | -0.952 | -7.965 |
| 2020-02-05 | -14.342 | 0.755 | -2.626 |
| 2020-02-06 | -14.47 | 12.489 | 10.93 |
| 2020-02-07 | -16.594 | 7.211 | 6.267 |
| 2020-02-10 | -16.782 | -6.136 | -8.069 |
| 2020-02-11 | -16.196 | -0.653 | -2.429 |
| 2020-02-12 | -14.436 | 6.286 | 3.76 |
| 2020-02-13 | -15.592 | 5.484 | 3.633 |
| 2020-02-14 | -15.67 | -1.6 | 0.664 |
| 2020-02-17 | -15.52 | 7.496 | 5.393 |
| 2020-02-18 | -15.736 | 4.739 | 0.783 |
| 2020-02-19 | -15.574 | 10.625 | 8.902 |
| 2020-02-20 | -14.986 | 15.115 | 14.377 |
| 2020-02-21 | -16.265 | 24.212 | 22.215 |
| 2020-02-24 | -15.576 | 11.332 | 7.223 |
| 2020-02-25 | -17.604 | -0.891 | -2.576 |
| 2020-02-26 | -15.989 | 26.888 | 25.512 |
| 2020-02-27 | -16.541 | -4.232 | 19.205 |
| 2020-02-28 | -17.361 | 13.385 | 12.316 |
| 2020-03-02 | -19.174 | -15.985 | -16.986 |
| 2020-03-03 | -18.763 | 17.798 | 15.039 |
| 2020-03-04 | -20.108 | 29.876 | 23.892 |
| 2020-03-05 | -23.972 | 75.515 | 73.119 |
| 2020-03-06 | -27.162 | 93.002 | 73.43 |
| 2020-03-09 | -24.101 | -46.795 | -50.008 |
| 2020-03-10 | -35.871 | 11.836 | 8.983 |
| 2020-03-11 | -29.529 | 44.467 | 35.642 |
| 2020-03-12 | -27.853 | -58.678 | -67.116 |
| 2020-03-13 | -26.834 | 22.789 | 17.288 |
| 2020-03-16 | -32.766 | 6.87 | -3.562 |
| 2020-03-17 | -34.502 | -9.565 | -19.776 |
| 2020-03-18 | -36.238 | 2.039 | -6.805 |
| 2020-03-19 | -36.066 | 14.857 | 7.979 |
| 2020-03-20 | -39.331 | 43.158 | 39.432 |
| 2020-03-23 | -41.75 | -70.404 | -72.167 |
| 2020-03-24 | -39.389 | -55.134 | -58.027 |
| 2020-03-25 | -51.992 | -17.259 | -23.16 |
| 2020-03-26 | -49.634 | 30.817 | 30.535 |
| 2020-03-27 | -47.623 | 28.579 | 26.315 |
| 2020-03-30 | -48.133 | -146.503 | -40.218 |
| 2020-03-31 | -46.944 | 27.685 | 18.398 |
| 2020-04-01 | -47.766 | 4.038 | 3.901 |
| 2020-04-02 | -47.564 | 18.355 | 6.038 |
| 2020-04-03 | -46.474 | -13.673 | -20.213 |
| 2020-04-06 | -46.279 | -22.292 | -29.286 |
| 2020-04-07 | -41.887 | 5.619 | 3.196 |
| 2020-04-08 | -42.537 | -30.487 | -35.695 |
| 2020-04-09 | -42.802 | -0.527 | -1.305 |
| 2020-04-10 | -44 | 0.624 | 0.576 |
| 2020-04-13 | -43.928 | -2.749 | -6.603 |
| 2020-04-14 | -43.721 | 36.586 | 32.498 |
| 2020-04-15 | -44.723 | 13.376 | 8.722 |
| 2020-04-16 | -45.254 | -7.922 | -9.694 |
| 2020-04-17 | -43.479 | 4.354 | -1.296 |
| 2020-04-20 | -44.335 | 36.413 | 28.567 |
| 2020-04-21 | -44.347 | -7.766 | -12.867 |
| 2020-04-22 | -43.083 | 1.985 | -0.117 |
| 2020-04-23 | -44.259 | 9.709 | 6.993 |
| 2020-04-24 | -45.479 | -8.68 | -11.777 |
| 2020-04-27 | -44.025 | 7.991 | 2.963 |
| 2020-04-28 | -45.03 | 1.089 | -3.489 |
| 2020-04-29 | -45.493 | 16.358 | 0.377 |
| 2020-04-30 | -40.464 | 10.446 | 3.45 |
| 2020-05-01 | -39.694 | 2.854 | 1.086 |
| 2020-05-04 | -37.747 | -6.293 | -8.529 |
| 2020-05-05 | -42.983 | 0.054 | -2.486 |
| 2020-05-06 | -43.049 | 14.386 | 7.3 |
| 2020-05-07 | -43.91 | 1.15 | 0.214 |
| 2020-05-08 | -43.186 | 0.91 | -4.191 |
| 2020-05-11 | -43.284 | 6.964 | 4.935 |
| 2020-05-12 | -43.496 | 13.94 | 10.788 |
| 2020-05-13 | -42.961 | 15.962 | 12.9 |
| 2020-05-14 | -45.326 | -1.236 | -2.848 |
| 2020-05-15 | -45.659 | -20.816 | -22.541 |
| 2020-05-18 | -44.216 | -9.214 | -11.29 |
| 2020-05-19 | -44.237 | -4.651 | -7.603 |
| 2020-05-20 | -44.6 | 8.616 | 7.029 |
| 2020-05-21 | -43.608 | 0.75 | -1.679 |
| 2020-05-22 | -43.253 | -0.397 | -0.386 |
| 2020-05-25 | -43.446 | 6.164 | -20.979 |
| 2020-05-26 | -38.528 | 0.272 | -6.276 |
| 2020-05-27 | -37.062 | -4.354 | -6.847 |
| 2020-05-28 | -36.818 | 46.271 | 3.736 |
| 2020-05-29 | -35.902 | -12.319 | 0.533 |
| 2020-06-01 | -32.53 | 7.186 | -4.461 |
| 2020-06-02 | -31.503 | -25.766 | -7.413 |
| 2020-06-03 | -29.955 | -13.292 | -16.936 |
| 2020-06-04 | -29.341 | -20.476 | -22.785 |
| 2020-06-05 | -29.953 | 10.627 | 6.615 |
| 2020-06-08 | -31.434 | 19.593 | 16.922 |
| 2020-06-09 | -33.893 | 11.883 | 7.57 |
| 2020-06-10 | -30.829 | 34.108 | 33.689 |
| 2020-06-11 | -32.305 | 3.324 | -0.187 |
| 2020-06-12 | -32.129 | 5.782 | 6.829 |
| 2020-06-15 | -31.141 | -21.183 | -22.401 |
| 2020-06-16 | -29.246 | 11.867 | 4.497 |
| 2020-06-17 | -30.78 | 10.689 | 2.391 |
| 2020-06-18 | -30.184 | -3.281 | -4.948 |
| 2020-06-19 | -30.276 | 8.196 | 6.371 |
| 2020-06-22 | -31.442 | -5.887 | -7.519 |
| 2020-06-23 | -33.199 | 8.615 | 6.092 |
| 2020-06-24 | -31.843 | 13.678 | 13.207 |
| 2020-06-25 | -31.695 | 7.524 | 3.51 |
| 2020-06-26 | -29.875 | 6.251 | 4.693 |
| 2020-06-29 | -31.463 | 10.221 | -1.911 |
| 2020-06-30 | -31.327 | -18.282 | -20.922 |
| 2020-07-01 | -30.932 | 4.192 | 7.693 |
| 2020-07-02 | -30.446 | -1.329 | -1.679 |
| 2020-07-03 | -29.086 | -1.556 | -4.78 |
| 2020-07-06 | -28.915 | 4.344 | 2.709 |
| 2020-07-07 | -29.622 | 10.594 | 4.623 |
| 2020-07-08 | -29.839 | 10.169 | 7.957 |
| 2020-07-09 | -29.212 | 10.493 | 7.604 |
| 2020-07-10 | -30.725 | -12.523 | -13.53 |
| 2020-07-13 | -27.684 | 16.45 | 13.823 |
| 2020-07-14 | -30.859 | -4.603 | -7.263 |
| 2020-07-15 | -30.351 | 5.366 | 3.671 |
| 2020-07-16 | -30.649 | -0.158 | -2.164 |
| 2020-07-17 | -30.998 | 3.839 | 1.958 |
| 2020-07-20 | -31.926 | -2.905 | -4.352 |
| 2020-07-21 | -32.694 | 8.861 | 6.976 |
| 2020-07-22 | -32.707 | 1.318 | 0.222 |
| 2020-07-23 | -32.905 | -4.144 | -4.006 |
| 2020-07-24 | -31.436 | 8.475 | 4.69 |
| 2020-07-27 | -30.801 | 5.257 | 5.792 |
| 2020-07-28 | -30.404 | 1.323 | -2.201 |
| 2020-07-29 | -30.239 | 13.609 | 11.091 |
| 2020-07-30 | -30.473 | 2.278 | -4.968 |
| 2020-07-31 | -30.874 | -0.272 | -0.733 |
| 2020-08-03 | -30.516 | 7.744 | 3.89 |
| 2020-08-04 | -30.962 | -6.331 | -9.929 |
| 2020-08-05 | -31.561 | 6.364 | 5.089 |
| 2020-08-06 | -30.426 | -7.87 | -8.327 |
| 2020-08-07 | -29.662 | 1.443 | -0.707 |
| 2020-08-10 | -29.284 | -12.611 | -14.247 |
| 2020-08-11 | -29 | -7.074 | -8.901 |
| 2020-08-12 | -28.855 | -0.674 | -3.699 |
| 2020-08-13 | -29.317 | 1.949 | 0.112 |
| 2020-08-14 | -29.336 | 5.636 | 4.952 |
| 2020-08-17 | -29.824 | 4.784 | 2.353 |
| 2020-08-18 | -30.486 | 2.189 | 0.643 |
| 2020-08-19 | -29.883 | 4.719 | 3.365 |
| 2020-08-20 | -30.491 | 0.153 | -1.071 |
| 2020-08-21 | -29.327 | -0.446 | -2.913 |
| 2020-08-24 | -30.264 | -13.887 | -15.818 |
| 2020-08-25 | -31.061 | -3.093 | -5.255 |
| 2020-08-26 | -31.533 | -1.28 | -3.813 |
| 2020-08-27 | -29.91 | 1.828 | -0.334 |
| 2020-08-28 | -30.384 | 35.857 | -3.725 |
| 2020-08-31 | -30.101 | 6.44 | 2.406 |
| 2020-09-01 | -31.417 | 13.92 | 10.898 |
| 2020-09-02 | -31.487 | 8.247 | 6.179 |
| 2020-09-03 | -32.196 | -0.165 | -1.534 |
| 2020-09-04 | -31.046 | -4.115 | -4.947 |
| 2020-09-07 | -31.356 | 14.143 | 12.681 |
| 2020-09-08 | -32.299 | -6.802 | -11.371 |
| 2020-09-09 | -31.293 | -3.225 | -4.715 |
| 2020-09-10 | -29.689 | 12.896 | 9.772 |
| 2020-09-11 | -29.865 | 4.313 | 2.069 |
| 2020-09-14 | -29.617 | 0.924 | -0.763 |
| 2020-09-15 | -29.184 | 5.189 | 0.244 |
| 2020-09-16 | -25.88 | 4.653 | 3.67 |
| 2020-09-17 | -26.536 | -3.414 | -7.891 |
| 2020-09-18 | -25.58 | 13.459 | 12.238 |
| 2020-09-21 | -26.516 | -1.849 | -3.507 |
| 2020-09-22 | -26.772 | -0.931 | -3.387 |
| 2020-09-23 | -27.473 | 10.364 | 6.779 |
| 2020-09-24 | -26.589 | 5.726 | 2.99 |
| 2020-09-25 | -27.972 | -8.407 | -5.422 |
| 2020-09-28 | -28.407 | 10.433 | 5.607 |
| 2020-09-29 | -27.817 | 32.193 | -4.69 |
| 2020-09-30 | -25.745 | 0.521 | -3.635 |
| 2020-10-01 | -26.039 | 6.964 | 2.311 |
| 2020-10-02 | -26.972 | -5.977 | -7.257 |
| 2020-10-05 | -28.294 | -6.47 | -7.565 |
| 2020-10-06 | -26.883 | -3.009 | -5.325 |
| 2020-10-07 | -26.512 | 1.53 | -0.211 |
| 2020-10-08 | -26.759 | 0.85 | -1.776 |
| 2020-10-09 | -26.96 | -2.574 | -3.478 |
| 2020-10-12 | -26.284 | 6.772 | 4.634 |
| 2020-10-13 | -26.626 | 6.214 | 3.688 |
| 2020-10-14 | -26.761 | 13.357 | 12.809 |
| 2020-10-15 | -26.342 | -1.861 | -2.635 |
| 2020-10-16 | -26.182 | -5.952 | -6.731 |
| 2020-10-19 | -26.348 | -0.031 | -2.464 |
| 2020-10-20 | -25.238 | -3.25 | -5.251 |
| 2020-10-21 | -25.476 | 0.074 | -3.148 |
| 2020-10-22 | -28.25 | -1.26 | -4.179 |
| 2020-10-23 | -27.553 | 8.508 | 7.198 |
| 2020-10-26 | -28.053 | 7.572 | 6.425 |
| 2020-10-27 | -27.556 | 13.005 | 8.631 |
| 2020-10-28 | -26.983 | -3.221 | -5.546 |
| 2020-10-29 | -28.003 | 14.92 | -5.354 |
| 2020-10-30 | -26.697 | -0.388 | -2.121 |
| 2020-11-02 | -27.12 | -4.933 | -4.244 |
| 2020-11-03 | -27.716 | 7.149 | -0.206 |
| 2020-11-04 | -27.028 | 4.896 | -10.876 |
| 2020-11-05 | -27.544 | -3.115 | -4.341 |
| 2020-11-06 | -26.61 | -19.078 | -21.735 |
| 2020-11-09 | -24.179 | -2.137 | -6.02 |
| 2020-11-10 | -25.532 | -0.691 | -2.422 |
| 2020-11-11 | -26.34 | 11.283 | 9.053 |
| 2020-11-12 | -25.254 | 6.324 | 4.37 |
| 2020-11-13 | -24.444 | 2.914 | -8.222 |
| 2020-11-16 | -23.827 | 5.739 | 4.16 |
| 2020-11-17 | -26.316 | 0.331 | -1.209 |
| 2020-11-18 | -25.94 | 2.795 | 3.284 |
| 2020-11-19 | -25.166 | 2.784 | -0.045 |
| 2020-11-20 | -26.01 | 4.25 | -4.946 |
| 2020-11-23 | -23.906 | 0.221 | -1.646 |
| 2020-11-24 | -28.317 | 4.179 | 0.71 |
| 2020-11-25 | -24.918 | 2.457 | 0.249 |
| 2020-11-26 | -24.349 | 8.365 | 1.726 |
| 2020-11-27 | -24.255 | 7.924 | 3.744 |
| 2020-11-30 | -24.002 | -3.4 | 1.731 |
| 2020-12-01 | -23.051 | -0.606 | -2.625 |
| 2020-12-02 | -23.194 | 5.147 | 1.606 |
| 2020-12-03 | -23.353 | -2.517 | -4.078 |
| 2020-12-04 | -23.914 | 8.522 | 7.229 |
| 2020-12-07 | -23.957 | 5.067 | 4.07 |
| 2020-12-08 | -23.636 | -0.458 | -3.139 |
| 2020-12-09 | -24.428 | -2.33 | 3.26 |
| 2020-12-10 | -24.011 | 13.331 | 11.945 |
| 2020-12-11 | -24.216 | -1.915 | -4.209 |
| 2020-12-14 | -24.253 | 1.364 | -0.876 |
| 2020-12-15 | -23.963 | -0.783 | -6.309 |
| 2020-12-16 | -23.589 | 6.845 | 2.568 |
| 2020-12-17 | -22.703 | 0.867 | -2.376 |
| 2020-12-18 | -22.229 | 7.89 | 7.935 |
| 2020-12-21 | -20.821 | 2.898 | 1.041 |
| 2020-12-22 | -21.543 | -4.107 | -7.187 |
| 2020-12-23 | -21.994 | 2.585 | 1.753 |
| 2020-12-24 | -21.727 | 1.713 | 0.442 |
| 2020-12-28 | -21.491 | 1.41 | -0.737 |
| 2020-12-29 | -21.097 | 2.401 | 1.088 |
| 2020-12-30 | -22.042 | 3.527 | 2.684 |
| 2020-12-31 | -22.096 | 2.428 | 1.431 |
| 2021-01-04 | -21.447 | 1.828 | -1.628 |
| 2021-01-05 | -22.649 | -5.531 | -6.878 |
| 2021-01-06 | -24.108 | 1.015 | -3.861 |
| 2021-01-07 | -23.862 | 0.426 | 0.711 |
| 2021-01-08 | -23.664 | 0.741 | 0.467 |
| 2021-01-11 | -22.989 | -2.39 | -3.845 |
| 2021-01-12 | -23.456 | 13.958 | 6.807 |
| 2021-01-13 | -22.087 | 3.314 | 0.152 |
| 2021-01-14 | -20.447 | 3.729 | 0.831 |
| 2021-01-15 | -22.069 | 1.114 | -0.528 |
| 2021-01-18 | -21.508 | 5.26 | -1.015 |
| 2021-01-19 | -19.748 | 2.889 | 0.877 |
| 2021-01-20 | -20.049 | 0.34 | -1.653 |
| 2021-01-21 | -21.103 | 2.837 | 1.644 |
| 2021-01-22 | -22.182 | 7.52 | 6.018 |
| 2021-01-25 | -20.786 | 1.688 | -1.272 |
| 2021-01-26 | -21.96 | 5.857 | 3.493 |
| 2021-01-27 | -21.161 | 3.011 | 1.004 |
| 2021-01-28 | -20.614 | -6.955 | -4.772 |
| 2021-01-29 | -20.811 | 4.507 | 2.078 |
| 2021-02-01 | -20.931 | -0.547 | -4.259 |
| 2021-02-02 | -22.28 | 1.447 | -6.006 |
| 2021-02-03 | -22.688 | -0.597 | -2.635 |
| 2021-02-04 | -23.098 | 3.354 | 0.333 |
| 2021-02-05 | -24.998 | 3.684 | -0.708 |
| 2021-02-08 | -23.932 | 1.583 | 0.457 |
| 2021-02-09 | -25.091 | 1.052 | -2.592 |
| 2021-02-10 | -24.924 | 4.118 | 1.442 |
| 2021-02-11 | -26.048 | 1.921 | -1.987 |
| 2021-02-12 | -25.984 | -1.27 | -3.84 |
| 2021-02-15 | -25.376 | 1.804 | -1.051 |
| 2021-02-16 | -24.429 | 5.509 | 3.276 |
| 2021-02-17 | -22.639 | 2.356 | 0.949 |
| 2021-02-18 | -22.689 | 1.654 | -0.753 |
| 2021-02-19 | -24.194 | 4.28 | 4.395 |
| 2021-02-22 | -24.216 | 1.148 | -2.031 |
| 2021-02-23 | -23.71 | 2.149 | 0.915 |
| 2021-02-24 | -25.096 | 6.025 | 3.456 |
| 2021-02-25 | -23.918 | 5.798 | 8.922 |
| 2021-02-26 | -25.272 | 0.458 | -1.998 |
| 2021-03-01 | -25.381 | -4.264 | -7.32 |
| 2021-03-02 | -25.505 | 3.715 | -4.704 |
| 2021-03-03 | -24.535 | 4.409 | 2.822 |
| 2021-03-04 | -25.309 | 5.097 | 0.768 |
| 2021-03-05 | -20.81 | -0.129 | -1.799 |
| 2021-03-08 | -24.655 | 3.921 | 2.299 |
| 2021-03-09 | -26.21 | 2.999 | 1.87 |
| 2021-03-10 | -25.384 | -2.305 | -4.422 |
| 2021-03-11 | -23.614 | 4.587 | -1.119 |
| 2021-03-12 | -23.359 | 4.472 | 3.103 |
| 2021-03-15 | -22.817 | 0.65 | -1.087 |
| 2021-03-16 | -24.737 | 1.166 | -2.234 |
| 2021-03-17 | -17.102 | 2.162 | -4.191 |
| 2021-03-18 | -17.235 | 2.36 | 0.535 |
| 2021-03-19 | -14.143 | 7.126 | 4.83 |
| 2021-03-22 | -15.219 | 2.896 | 1.122 |
| 2021-03-23 | -12.506 | 5.261 | 0.161 |
| 2021-03-24 | -11.693 | 5.737 | 3.435 |
| 2021-03-25 | -11.89 | 1.813 | -1.879 |
| 2021-03-26 | -10.19 | 1.127 | -2.023 |
| 2021-03-29 | -9.544 | 2.831 | -2.207 |
| 2021-03-30 | -8.924 | 0.23 | -0.21 |
| 2021-03-31 | -8.427 | 3.59 | -0.573 |
| 2021-04-01 | -8.525 | 2.019 | 1.876 |
| 2021-04-02 | -8.42 | 4.207 | 1.519 |
| 2021-04-05 | -7.773 | 2.889 | -0.114 |
| 2021-04-06 | -9.275 | -0.491 | -1.055 |
| 2021-04-07 | -8.528 | 4.378 | 2.675 |
| 2021-04-08 | -8.9 | 1.207 | -3.108 |
| 2021-04-09 | -8.548 | 1.833 | 1.321 |
| 2021-04-12 | -8.812 | -1.233 | 0.902 |
| 2021-04-13 | -8.572 | 2.851 | -4.571 |
| 2021-04-14 | -10.524 | 4.884 | 4.176 |
| 2021-04-15 | -9.555 | 2.046 | -0.899 |
| 2021-04-16 | -8.731 | 12.4 | -0.121 |
| 2021-04-19 | -8.25 | -6.785 | 2.154 |
| 2021-04-20 | -8.472 | 3.768 | 1.61 |
| 2021-04-21 | -8.107 | 2.214 | -0.935 |
| 2021-04-22 | -7.459 | 2.032 | -1.589 |
| 2021-04-23 | -6.994 | 1.656 | -1.631 |
| 2021-04-26 | -8.248 | 1.905 | 0.04 |
| 2021-04-27 | -8.035 | 3.802 | -0.973 |
| 2021-04-28 | -8.212 | 1.961 | -2.851 |
| 2021-04-29 | -7.18 | -0.139 | 0.095 |
| 2021-04-30 | -6.205 | 3.328 | -0.681 |
| 2021-05-03 | -7.055 | 3.473 | 2.264 |
| 2021-05-04 | -7.45 | 0.829 | -1.597 |
| 2021-05-05 | -6.781 | 4.344 | 2.519 |
| 2021-05-06 | -6.948 | 2.919 | 1.059 |
| 2021-05-07 | -6.112 | 3.904 | -0.704 |
| 2021-05-10 | -6.165 | 6.811 | -0.99 |
| 2021-05-11 | -5.832 | 3.406 | -0.549 |
| 2021-05-12 | -5.864 | 2.271 | 0.294 |
| 2021-05-13 | -5.995 | 1.328 | -0.096 |
| 2021-05-14 | -6.256 | 0.471 | -0.941 |
| 2021-05-17 | -6.836 | 2.675 | 0.849 |
| 2021-05-18 | -7.374 | 4.721 | 2.6 |
| 2021-05-19 | -6.817 | 1.904 | -0.731 |
| 2021-05-20 | -6.819 | -1.553 | 0.179 |
| 2021-05-21 | -7.023 | 6.467 | 0.162 |
| 2021-05-24 | -7.085 | 2.129 | 0.808 |
| 2021-05-25 | -7.713 | 4.689 | 1.308 |
| 2021-05-26 | -6.785 | 3.634 | -4.945 |
| 2021-05-27 | -6.393 | 1.686 | -0.012 |
| 2021-05-28 | -6.9 | -1.728 | 0.484 |
| 2021-05-31 | -6.083 | 2.165 | 0.03 |
| 2021-06-01 | -5.967 | 1.595 | -1.241 |
| 2021-06-02 | -6.876 | 1.239 | -1.022 |
| 2021-06-03 | -6.783 | 3.385 | -0.887 |
| 2021-06-04 | -7.202 | 0.741 | 1.021 |
| 2021-06-07 | -7.352 | 2.104 | 1.63 |
| 2021-06-08 | -6.687 | 3.396 | 2.505 |
| 2021-06-09 | -6.478 | 1.229 | -1.063 |
| 2021-06-10 | -6.373 | 5.448 | -0.055 |
| 2021-06-11 | -6.541 | 2.058 | 0.154 |
| 2021-06-14 | -6.123 | 4.635 | -1.532 |
| 2021-06-15 | -6.497 | 4.387 | 0.535 |
| 2021-06-16 | -6.851 | 2.264 | 0.96 |
| 2021-06-17 | -6.404 | 4.037 | 0.99 |
| 2021-06-18 | -7.168 | 3.786 | 3.912 |
| 2021-06-21 | -7.688 | 6.496 | -2.655 |
| 2021-06-22 | -6.741 | 0.286 | -0.679 |
| 2021-06-23 | -6.415 | 1.466 | -1.099 |
| 2021-06-24 | -6.481 | -0.46 | -4.822 |
| 2021-06-25 | -6.375 | -0.027 | 1.356 |
| 2021-06-28 | -6.411 | 4.375 | 0.246 |
| 2021-06-29 | -6.782 | 1.837 | 2.857 |
| 2021-06-30 | -5.758 | 2.347 | -0.728 |
| 2021-07-01 | -5.608 | 0.232 | -0.506 |
| 2021-07-02 | -5.325 | -0.086 | -1.662 |
| 2021-07-05 | -5.789 | 6.55 | 4.131 |
| 2021-07-06 | -5.847 | 7.258 | 3.779 |
| 2021-07-07 | -5.651 | 6.633 | 4.647 |
| 2021-07-08 | -5.363 | 0.057 | -1.486 |
| 2021-07-09 | -5.029 | 0.373 | -0.094 |
| 2021-07-12 | -5.431 | 2.337 | 0.595 |
| 2021-07-13 | -5.405 | 3.672 | 1.132 |
| 2021-07-14 | -5.443 | -0.993 | 0.427 |
| 2021-07-15 | -4.94 | 5.32 | 2.492 |
| 2021-07-16 | -5.211 | 8.884 | 9.434 |
| 2021-07-19 | -5.311 | 3.273 | 4.984 |
| 2021-07-20 | -5.566 | -0.937 | -5.975 |
| 2021-07-21 | -5.541 | 1.177 | -1.411 |
| 2021-07-22 | -5.53 | 0.497 | -1.547 |
| 2021-07-23 | -5.162 | 5.474 | 3.174 |
| 2021-07-26 | -4.967 | 3.311 | 1.768 |
| 2021-07-27 | -5.23 | 2.599 | -0.132 |
| 2021-07-28 | -5.664 | 1.181 | -1.567 |
| 2021-07-29 | -5.19 | 3.177 | -0.785 |
| 2021-07-30 | -5.58 | 2.558 | 3.08 |
| 2021-08-02 | -5.171 | 4.439 | 1.806 |
| 2021-08-03 | -5.778 | 0.553 | -0.191 |
| 2021-08-04 | -5.785 | 3.635 | 3.805 |
| 2021-08-05 | -5.592 | 0.703 | -3.686 |
| 2021-08-06 | -4.986 | 2.891 | 1.475 |
| 2021-08-09 | -5.326 | 2.003 | 1.507 |
| 2021-08-10 | -5.583 | 1.511 | 0.601 |
| 2021-08-11 | -5.099 | -0.276 | -0.625 |
| 2021-08-12 | -5.306 | 2.313 | 0.78 |
| 2021-08-13 | -5.394 | 1.646 | 3.054 |
| 2021-08-16 | -5.696 | 1.815 | 0.53 |
| 2021-08-17 | -5.244 | 1.862 | 1.245 |
| 2021-08-18 | -5.45 | 1.253 | 1.131 |
| 2021-08-19 | -5.671 | 2.818 | 2.043 |
| 2021-08-20 | -6.122 | -0.447 | -1.364 |
| 2021-08-23 | -5.595 | 0.848 | -0.087 |
| 2021-08-24 | -5.438 | 3.473 | -2.708 |
| 2021-08-25 | -5.328 | 1.324 | -1.327 |
| 2021-08-26 | -5.37 | 0.902 | -1.316 |
| 2021-08-27 | -5.331 | -2.29 | -1.345 |
| 2021-08-30 | -5.274 | 0.676 | -3.294 |
| 2021-08-31 | -5.743 | 2.44 | 0.792 |
| 2021-09-01 | -5.43 | 3.035 | 0.554 |
| 2021-09-02 | -5.69 | 0.958 | -1.206 |
| 2021-09-03 | -5.673 | 0.129 | -0.251 |
| 2021-09-06 | -5.709 | 0.17 | -1.408 |
| 2021-09-07 | -5.316 | 3.675 | 1.253 |
| 2021-09-08 | -4.991 | 1.874 | 1.493 |
| 2021-09-09 | -4.988 | 1.278 | -1.249 |
| 2021-09-10 | -5.344 | 1.326 | 0.276 |
| 2021-09-13 | -5.228 | 2.605 | 2.799 |
| 2021-09-14 | -6.045 | 2.377 | -1.773 |
| 2021-09-15 | -4.703 | 1.038 | -2.496 |
| 2021-09-16 | -5.218 | 4.646 | -0.033 |
| 2021-09-17 | -5.569 | 7.766 | 8.269 |
| 2021-09-20 | -5.218 | 2.502 | 2.87 |
| 2021-09-21 | -5.386 | 0.671 | -1.088 |
| 2021-09-22 | -5.022 | -0.456 | -5.025 |
| 2021-09-23 | -5.869 | 4.061 | -2.842 |
| 2021-09-24 | -4.63 | 4.031 | 1.787 |
| 2021-09-27 | -4.543 | 5.117 | -0.555 |
| 2021-09-28 | -4.795 | 2.652 | 0.786 |
| 2021-09-29 | -4.567 | -2.529 | -0.222 |
| 2021-09-30 | -4.481 | 6.871 | 2.544 |
| 2021-10-01 | -4.406 | 3.636 | 2.488 |
| 2021-10-04 | -4.686 | 2.309 | -1.458 |
| 2021-10-05 | -4.853 | 6.202 | 2.826 |
| 2021-10-06 | -4.694 | 1.582 | -1.263 |
| 2021-10-07 | -4.299 | 3.247 | -0.39 |
| 2021-10-08 | -4.649 | 0.913 | -0.676 |
| 2021-10-11 | -5.752 | 4.09 | 1.132 |
| 2021-10-12 | -4.584 | 14.707 | 5.796 |
| 2021-10-13 | -5.259 | 1.697 | 1.506 |
| 2021-10-14 | -4.845 | 1.202 | -1.505 |
| 2021-10-15 | -4.807 | 1.365 | -2.037 |
| 2021-10-18 | -5.302 | 2.264 | -4.183 |
| 2021-10-19 | -5.118 | 4.937 | -2.638 |
| 2021-10-20 | -4.54 | 1.516 | 1.49 |
| 2021-10-21 | -5.775 | 2.477 | 3.794 |
| 2021-10-22 | -5.248 | 2.213 | 1.59 |
| 2021-10-25 | -4.559 | 1.19 | -1.565 |
| 2021-10-26 | -4.459 | 11.47 | 10.236 |
| 2021-10-27 | -5.319 | 1.905 | 0.743 |
| 2021-10-28 | -5.429 | -2.287 | -4.832 |
| 2021-10-29 | -5.134 | 5.919 | -0.499 |
| 2021-11-01 | -5.25 | 4.556 | 4.91 |
| 2021-11-02 | -4.987 | 3.549 | -1.035 |
| 2021-11-03 | -5.328 | 2.632 | -1.172 |
| 2021-11-04 | -5.102 | 0.86 | -0.543 |
| 2021-11-05 | -5.711 | -0.337 | -0.481 |
| 2021-11-08 | -5.258 | 5.665 | 5.8 |
| 2021-11-09 | -6.448 | 3.205 | -0.075 |
| 2021-11-10 | -5.522 | 2.565 | 8.541 |
| 2021-11-11 | -5.233 | 3.932 | 10.928 |
| 2021-11-12 | -5.112 | 3.146 | 0.028 |
| 2021-11-15 | -5.43 | 3.371 | -3.759 |
| 2021-11-16 | -5.588 | 0.828 | -0.014 |
| 2021-11-17 | -4.901 | 2.88 | 1.361 |
| 2021-11-18 | -5.582 | 5.598 | 4.014 |
| 2021-11-19 | -5.814 | 3.57 | -2.834 |
| 2021-11-22 | -5.715 | 5.774 | -1.422 |
| 2021-11-23 | -6.494 | 0.192 | -2.397 |
| 2021-11-24 | -6.684 | 6.51 | 5.676 |
| 2021-11-25 | -6.999 | 10.481 | 11.852 |
| 2021-11-26 | -6.544 | 0.875 | -2.741 |
| 2021-11-29 | -6.262 | 7.631 | 4.357 |
| 2021-11-30 | -6.197 | 3.69 | 1.805 |
| 2021-12-01 | -6.326 | 7.446 | 3.465 |
| 2021-12-02 | -6.498 | 2.457 | -3.169 |
| 2021-12-03 | -6.179 | 2.853 | 17.612 |
| 2021-12-06 | -6.051 | -1.344 | -3.647 |
| 2021-12-07 | -5.275 | -4.78 | -7.201 |
| 2021-12-08 | -4.861 | 3.23 | -3.015 |
| 2021-12-09 | -6.698 | 3.083 | -1.413 |
| 2021-12-10 | -6.49 | 7.632 | 4.415 |
| 2021-12-13 | -5.882 | 3.805 | 0.64 |
| 2021-12-14 | -5.63 | 5.573 | -3.849 |
| 2021-12-15 | -5.477 | 2.755 | -1.28 |
| 2021-12-16 | -5.356 | 10.147 | 3.942 |
| 2021-12-17 | -5.201 | 5.58 | 2.087 |
| 2021-12-20 | -5.399 | 7.78 | -3.419 |
| 2021-12-21 | -5.244 | 0.699 | 0.66 |
| 2021-12-22 | -5.295 | -3.258 | -8.595 |
| 2021-12-23 | -5.085 | 4.292 | 4.068 |
| 2021-12-24 | -5.767 | 0.283 | -1.312 |
| 2021-12-27 | -5.676 | -0.138 | -1.945 |
| 2021-12-28 | -5.252 | 2.358 | -5.687 |
| 2021-12-29 | -4.895 | 0.633 | -1.845 |
| 2021-12-30 | -5.643 | 2.17 | -2.367 |
| 2021-12-31 | -5.944 | 5.444 | 5.6 |
| 2022-01-03 | -6.548 | -1.894 | -1.363 |
| 2022-01-04 | -5.81 | 2.917 | -0.946 |
| 2022-01-05 | -5.928 | 9.85 | 2.532 |
| 2022-01-06 | -5.841 | 2.12 | 0.872 |
| 2022-01-07 | -6.439 | 3.587 | 1.589 |
| 2022-01-10 | -6.217 | 1.894 | 1.727 |
| 2022-01-11 | -5.376 | 5.134 | 2.105 |
| 2022-01-12 | -5.968 | 6.194 | 3.851 |
| 2022-01-13 | -5.361 | 5.347 | -0.458 |
| 2022-01-14 | -6.088 | 8.831 | 4.206 |
| 2022-01-17 | -5.171 | 3.662 | 1.566 |
| 2022-01-18 | -5.855 | -0.096 | -3.807 |
| 2022-01-19 | -5.471 | 3.81 | 1.245 |
| 2022-01-20 | -5.539 | 4.968 | 4.991 |
| 2022-01-21 | -5.664 | 7.457 | 5.256 |
| 2022-01-24 | -5.439 | 6.255 | -0.451 |
| 2022-01-25 | -5.542 | -0.167 | -2.32 |
| 2022-01-26 | -5.562 | 3.463 | -3.104 |
| 2022-01-27 | -5.028 | 5.181 | 3.377 |
| 2022-01-28 | -6.932 | 3.462 | -1.352 |
| 2022-01-31 | -7.757 | -0.98 | -0.682 |
| 2022-02-01 | -8.457 | -0.21 | -1.312 |
| 2022-02-02 | -7.952 | -1.246 | -3.6 |
| 2022-02-03 | -6.04 | 2.461 | 2.178 |
| 2022-02-04 | -7.195 | 1.591 | 1.808 |
| 2022-02-07 | -7.311 | -2.204 | -3.011 |
| 2022-02-08 | -5.999 | 6.989 | 0.436 |
| 2022-02-09 | -8.062 | 1.24 | -4.035 |
| 2022-02-10 | -7.869 | 7.84 | 6.416 |
| 2022-02-11 | -6.82 | 5.044 | 0.408 |
| 2022-02-14 | -7.094 | -1.376 | -2.47 |
| 2022-02-15 | -6.861 | 3.586 | 2.346 |
| 2022-02-16 | -6.289 | 3.84 | 2.463 |
| 2022-02-17 | -6.738 | 1.244 | -3.84 |
| 2022-02-18 | -7.084 | 3.355 | 4.606 |
| 2022-02-21 | -7.225 | 4.091 | -0.356 |
| 2022-02-22 | -7.053 | 9.669 | 7.371 |
| 2022-02-23 | -7.406 | 50.1 | 39.012 |
| 2022-02-24 | -12.084 | -26.145 | -32.028 |
| 2022-02-25 | -8.813 | 53.652 | 50.504 |
| 2022-02-28 | -15.386 | 44.112 | 41.791 |
| 2022-03-01 | -16.73 | -15.794 | -26.11 |
| 2022-03-02 | -16.805 | 12.73 | -0.744 |
| 2022-03-03 | -18.899 | 40.039 | 34.964 |
| 2022-03-04 | -20.941 | 69.382 | 63.971 |
| 2022-03-07 | -20.982 | 40.868 | 37.331 |
| 2022-03-08 | -19.75 | -35.976 | -42.162 |
| 2022-03-09 | -17.122 | -7.366 | -12.225 |
| 2022-03-10 | -20.13 | 6.745 | 3.771 |
| 2022-03-11 | -18.752 | -5.82 | -18.123 |
| 2022-03-14 | -20.611 | 1 | 7.263 |
| 2022-03-15 | -22.132 | -1.154 | -6.77 |
| 2022-03-16 | -21.924 | -69.888 | -67.754 |
| 2022-03-17 | -21.625 | 14.926 | 2.548 |
| 2022-03-18 | -20.459 | 8.49 | -2.037 |
| 2022-03-21 | -20.101 | 9.451 | 5.42 |
| 2022-03-22 | -21.688 | 11.997 | 9.463 |
| 2022-03-23 | -11.102 | 13.794 | 7.961 |
| 2022-03-24 | -11.26 | -3.554 | -2.263 |
| 2022-03-25 | -9.108 | -2.805 | -1.584 |
| 2022-03-28 | -9.902 | -7.59 | -14.444 |
| 2022-03-29 | -8.588 | 3.603 | 0.051 |
| 2022-03-30 | -8.383 | 2.619 | 7.759 |
| 2022-03-31 | -9.847 | 27.66 | 19.691 |
| 2022-04-01 | -13.753 | 2.468 | 3.963 |
| 2022-04-04 | -13.219 | 1.566 | -4.866 |
| 2022-04-05 | -12.259 | 10.173 | 4.114 |
| 2022-04-06 | -12.345 | -0.72 | -4.3 |
| 2022-04-07 | -12.923 | 7.19 | 2.215 |
| 2022-04-08 | -12.31 | 2.528 | -4.954 |
| 2022-04-11 | -12.54 | 2.235 | -2.898 |
| 2022-04-12 | -12.004 | 0.275 | -3.019 |
| 2022-04-13 | -11.091 | 5.715 | -1.5 |
| 2022-04-14 | -12.151 | 1.054 | 3.44 |
| 2022-04-15 | -12.163 | -0.532 | -1.632 |
| 2022-04-18 | -12.574 | -0.978 | -0.337 |
| 2022-04-19 | -12.331 | 5.763 | 6.392 |
| 2022-04-20 | -10.272 | 4.084 | -0.658 |
| 2022-04-21 | -11.958 | 9.585 | 6.729 |
| 2022-04-22 | -12.196 | 0.261 | 0.392 |
| 2022-04-25 | -14.146 | 3.816 | 2.192 |
| 2022-04-26 | -13.25 | 1.562 | -4.817 |
| 2022-04-27 | -13.675 | 2.777 | -2.021 |
| 2022-04-28 | -13.917 | -0.979 | -2.551 |
| 2022-04-29 | -13.116 | -3.398 | 1.808 |
| 2022-05-02 | -14.031 | 5.902 | 16.346 |
| 2022-05-03 | -16.038 | -6.88 | -9.011 |
| 2022-05-04 | -17.389 | 4.689 | -2.093 |
| 2022-05-05 | -12.888 | 6.745 | 5.284 |
| 2022-05-06 | -13.637 | 8.29 | 7.996 |
| 2022-05-09 | -14.905 | 8.98 | 6.301 |
| 2022-05-10 | -13.261 | 1.881 | -1.789 |
| 2022-05-11 | -13.593 | 11.55 | 7.987 |
| 2022-05-12 | -12.578 | 1.479 | -8.422 |
| 2022-05-13 | -12.868 | 5.429 | -2.87 |
| 2022-05-16 | -12.321 | -0.974 | -4.57 |
| 2022-05-17 | -12.904 | 6.298 | 3.277 |
| 2022-05-18 | -12.427 | 10.751 | 10.653 |
| 2022-05-19 | -11.191 | -5.615 | -8.486 |
| 2022-05-20 | -9.763 | -0.41 | -1.953 |
| 2022-05-23 | -10.299 | 2.668 | 1.72 |
| 2022-05-24 | -9.981 | -0.354 | -3.655 |
| 2022-05-25 | -11.059 | 8.098 | -9.883 |
| 2022-05-26 | -11.976 | 3.349 | 1.21 |
| 2022-05-27 | -12.61 | 1.834 | -2.893 |
| 2022-05-30 | -12.547 | 7.475 | -5.27 |
| 2022-05-31 | -12.243 | 2.268 | -3.733 |
| 2022-06-01 | -12.089 | 0.341 | -2.86 |
| 2022-06-02 | -12.055 | -0.268 | -2.758 |
| 2022-06-03 | -11.528 | 3.629 | 2.263 |
| 2022-06-06 | -11.149 | 4.993 | -3.81 |
| 2022-06-07 | -10.852 | 3.38 | -2.853 |
| 2022-06-08 | -10.797 | 3.992 | 0.243 |
| 2022-06-09 | -10.523 | 14.06 | -2.788 |
| 2022-06-10 | -10.865 | 2.664 | -2.482 |
| 2022-06-13 | -13.297 | 8.849 | -1.274 |
| 2022-06-14 | -11.497 | 3.515 | -1.941 |
| 2022-06-15 | -9.048 | 2.512 | -0.077 |
| 2022-06-16 | -9.824 | 3.405 | 1.836 |
| 2022-06-17 | -10.011 | 6.436 | 1.969 |
| 2022-06-20 | -9.974 | 2.49 | -1.068 |
| 2022-06-21 | -10.698 | 7.051 | 4.811 |
| 2022-06-22 | -10.63 | 3.124 | 3.21 |
| 2022-06-23 | -11.704 | -3.721 | -6.296 |
| 2022-06-24 | -11.126 | 1.294 | -2.266 |
| 2022-06-27 | -12.524 | 2.288 | -6.799 |
| 2022-06-28 | -11.459 | 6.613 | 5.661 |
| 2022-06-29 | -11.531 | 14.329 | 5.772 |
| 2022-06-30 | -10.326 | 4.689 | 5.912 |